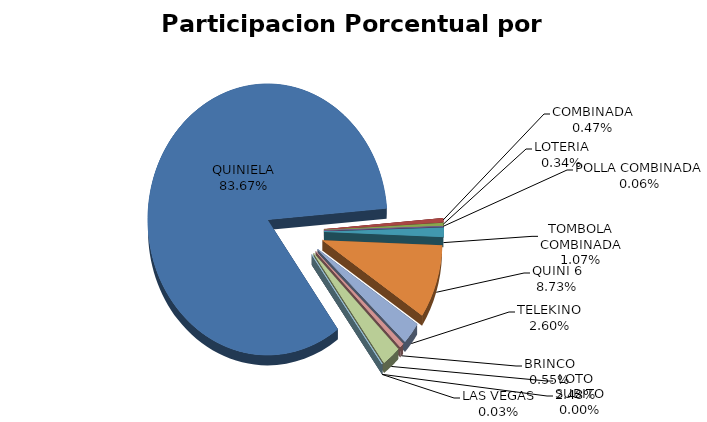
| Category | Series 0 |
|---|---|
| QUINIELA | 18102720.07 |
| COMBINADA | 100995.09 |
| LOTERIA | 74015.04 |
| POLLA COMBINADA | 13088.09 |
| TOMBOLA COMBINADA | 231768 |
| QUINI 6 | 1889313.881 |
| TELEKINO | 563261.4 |
| BRINCO | 118324.635 |
| LOTO | 535643.894 |
| SUBITO | 0 |
| LAS VEGAS | 7085.34 |